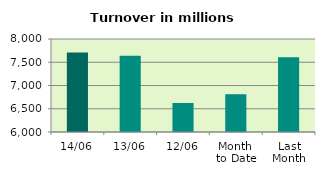
| Category | Series 0 |
|---|---|
| 14/06 | 7709.594 |
| 13/06 | 7639.11 |
| 12/06 | 6623.168 |
| Month 
to Date | 6812.354 |
| Last
Month | 7604.877 |